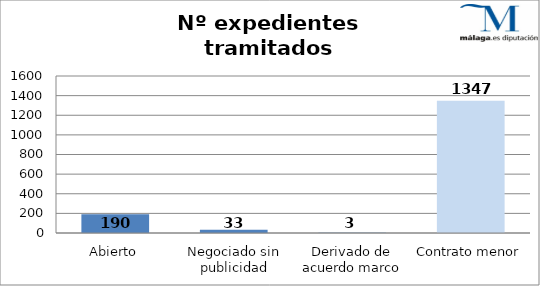
| Category | Nº expedientes |
|---|---|
| Abierto | 190 |
| Negociado sin publicidad | 33 |
| Derivado de acuerdo marco | 3 |
| Contrato menor | 1347 |